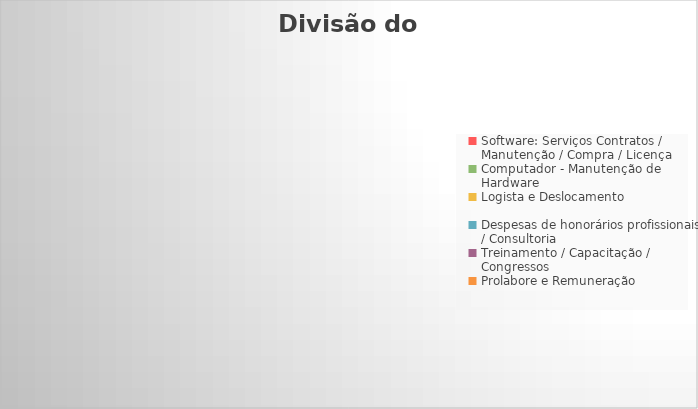
| Category | Divisão do Orçamento |
|---|---|
| Software: Serviços Contratos / Manutenção / Compra / Licença | 0 |
| Computador - Manutenção de Hardware  | 0 |
| Logista e Deslocamento | 0 |
| Despesas de honorários profissionais / Consultoria | 0 |
| Treinamento / Capacitação / Congressos | 0 |
| Prolabore e Remuneração | 0 |